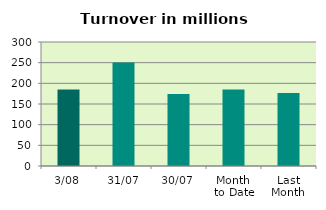
| Category | Series 0 |
|---|---|
| 3/08 | 185.324 |
| 31/07 | 250.285 |
| 30/07 | 173.997 |
| Month 
to Date | 185.324 |
| Last
Month | 176.477 |